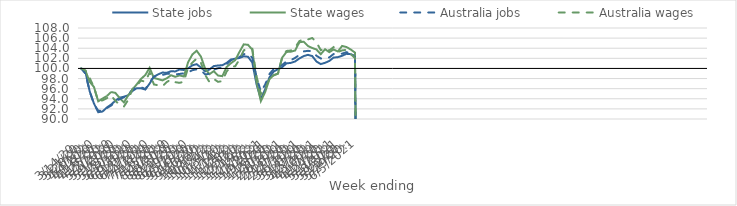
| Category | State jobs | State wages | Australia jobs | Australia wages |
|---|---|---|---|---|
| 14/03/2020 | 100 | 100 | 100 | 100 |
| 21/03/2020 | 99.321 | 99.562 | 98.972 | 99.605 |
| 28/03/2020 | 95.462 | 97.357 | 95.467 | 98.106 |
| 04/04/2020 | 93.056 | 96.328 | 92.921 | 96.238 |
| 11/04/2020 | 91.348 | 93.495 | 91.648 | 93.491 |
| 18/04/2020 | 91.48 | 94.044 | 91.631 | 93.694 |
| 25/04/2020 | 92.262 | 94.537 | 92.161 | 94.113 |
| 02/05/2020 | 92.856 | 95.338 | 92.658 | 94.66 |
| 09/05/2020 | 93.613 | 95.17 | 93.343 | 93.583 |
| 16/05/2020 | 94.226 | 94.152 | 93.936 | 92.817 |
| 23/05/2020 | 94.41 | 93.278 | 94.294 | 92.471 |
| 30/05/2020 | 94.689 | 94.679 | 94.802 | 93.799 |
| 06/06/2020 | 95.544 | 95.828 | 95.786 | 95.975 |
| 13/06/2020 | 96.097 | 96.862 | 96.286 | 96.648 |
| 20/06/2020 | 96.078 | 97.945 | 96.302 | 97.605 |
| 27/06/2020 | 95.831 | 98.697 | 95.914 | 97.364 |
| 04/07/2020 | 97 | 100.126 | 97.234 | 99.209 |
| 11/07/2020 | 98.362 | 98.108 | 98.377 | 96.842 |
| 18/07/2020 | 98.833 | 97.892 | 98.483 | 96.672 |
| 25/07/2020 | 99.185 | 97.64 | 98.707 | 96.464 |
| 01/08/2020 | 99.147 | 98.044 | 98.939 | 97.319 |
| 08/08/2020 | 99.438 | 98.662 | 98.937 | 97.774 |
| 15/08/2020 | 99.412 | 98.337 | 98.822 | 97.284 |
| 22/08/2020 | 99.788 | 98.619 | 98.911 | 97.15 |
| 29/08/2020 | 99.694 | 98.404 | 99.048 | 97.377 |
| 05/09/2020 | 100.024 | 101.238 | 99.236 | 100.159 |
| 12/09/2020 | 100.626 | 102.766 | 99.656 | 101.158 |
| 19/09/2020 | 100.839 | 103.502 | 99.825 | 101.963 |
| 26/09/2020 | 100.182 | 102.335 | 99.625 | 101.122 |
| 03/10/2020 | 99.437 | 99.904 | 98.824 | 98.703 |
| 10/10/2020 | 99.8 | 98.879 | 98.93 | 97.286 |
| 17/10/2020 | 100.464 | 99.461 | 99.758 | 97.926 |
| 24/10/2020 | 100.586 | 98.594 | 100.051 | 97.346 |
| 31/10/2020 | 100.641 | 98.474 | 100.234 | 97.513 |
| 07/11/2020 | 101.096 | 100.284 | 100.843 | 99.39 |
| 14/11/2020 | 101.764 | 101.033 | 101.614 | 100.362 |
| 21/11/2020 | 101.926 | 101.637 | 101.941 | 100.423 |
| 28/11/2020 | 102.069 | 103.259 | 102.262 | 101.777 |
| 05/12/2020 | 102.41 | 104.766 | 102.828 | 103.567 |
| 12/12/2020 | 102.306 | 104.672 | 102.902 | 104.028 |
| 19/12/2020 | 101.178 | 103.711 | 102.101 | 103.902 |
| 26/12/2020 | 96.833 | 97.293 | 98.307 | 98.441 |
| 02/01/2021 | 93.987 | 93.531 | 95.41 | 94.903 |
| 09/01/2021 | 95.856 | 95.325 | 96.79 | 95.912 |
| 16/01/2021 | 98.231 | 97.849 | 98.893 | 97.958 |
| 23/01/2021 | 99.39 | 98.67 | 99.862 | 98.634 |
| 30/01/2021 | 99.845 | 98.975 | 100.346 | 98.978 |
| 06/02/2021 | 100.28 | 102.158 | 100.698 | 102.329 |
| 13/02/2021 | 100.999 | 103.265 | 101.406 | 103.465 |
| 20/02/2021 | 101.098 | 103.305 | 101.644 | 103.55 |
| 27/02/2021 | 101.379 | 103.55 | 102.078 | 104.122 |
| 06/03/2021 | 101.974 | 105.181 | 102.697 | 105.405 |
| 13/03/2021 | 102.435 | 105.285 | 103.369 | 105.802 |
| 20/03/2021 | 102.692 | 104.442 | 103.483 | 105.731 |
| 27/03/2021 | 102.453 | 104.046 | 103.4 | 106.023 |
| 03/04/2021 | 101.365 | 103.744 | 102.51 | 105.184 |
| 10/04/2021 | 100.862 | 102.812 | 101.979 | 103.615 |
| 17/04/2021 | 101.113 | 103.799 | 101.926 | 103.956 |
| 24/04/2021 | 101.484 | 103.223 | 102.186 | 103.563 |
| 01/05/2021 | 102.15 | 103.753 | 102.848 | 104.217 |
| 08/05/2021 | 102.235 | 103.359 | 102.834 | 103.251 |
| 15/05/2021 | 102.51 | 104.456 | 102.922 | 103.573 |
| 22/05/2021 | 102.891 | 104.243 | 103.224 | 103.677 |
| 29/05/2021 | 102.819 | 103.746 | 102.941 | 102.856 |
| 05/06/2021 | 102.493 | 103.135 | 102.252 | 102.059 |